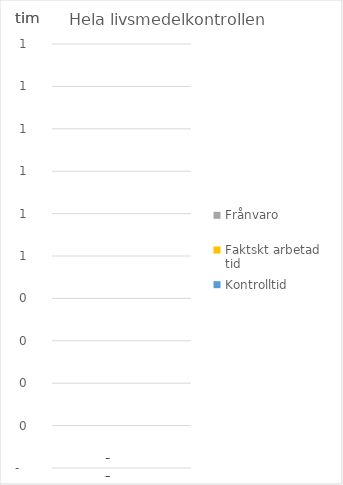
| Category | Faktskt arbetad tid | Frånvaro |
|---|---|---|
| 0 | 0 | 0 |